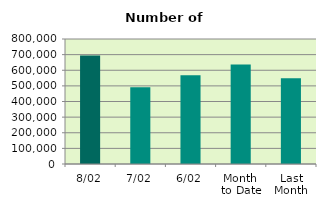
| Category | Series 0 |
|---|---|
| 8/02 | 694644 |
| 7/02 | 491844 |
| 6/02 | 568370 |
| Month 
to Date | 637293.333 |
| Last
Month | 549126.273 |